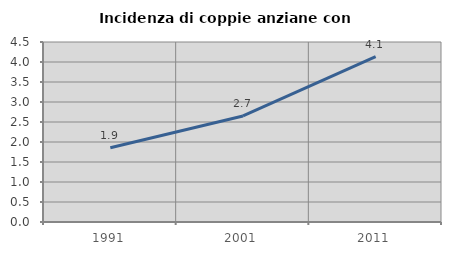
| Category | Incidenza di coppie anziane con figli |
|---|---|
| 1991.0 | 1.857 |
| 2001.0 | 2.652 |
| 2011.0 | 4.135 |